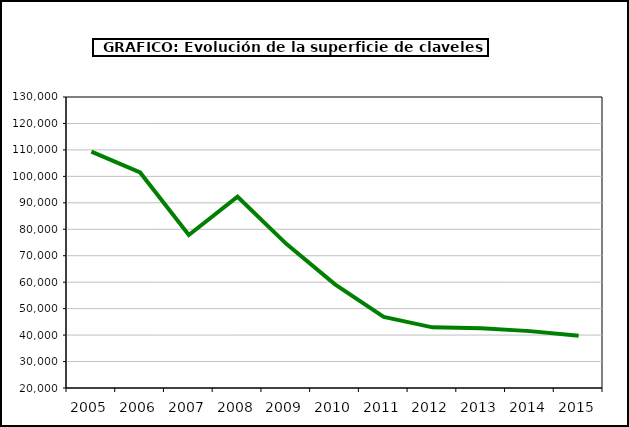
| Category | superficie |
|---|---|
| 2005.0 | 109381 |
| 2006.0 | 101473 |
| 2007.0 | 77836 |
| 2008.0 | 92310 |
| 2009.0 | 74481 |
| 2010.0 | 59199 |
| 2011.0 | 46860 |
| 2012.0 | 42920 |
| 2013.0 | 42572 |
| 2014.0 | 41501 |
| 2015.0 | 39713 |